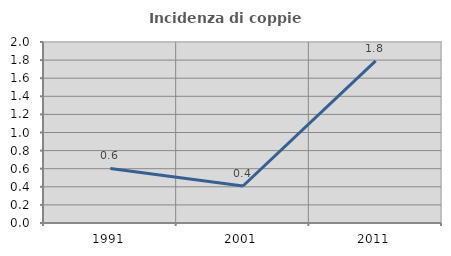
| Category | Incidenza di coppie miste |
|---|---|
| 1991.0 | 0.602 |
| 2001.0 | 0.408 |
| 2011.0 | 1.791 |